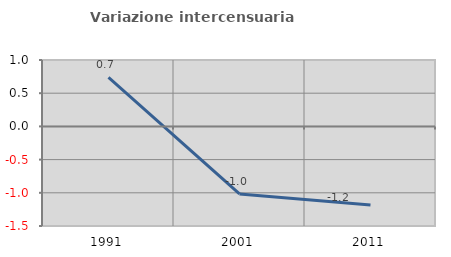
| Category | Variazione intercensuaria annua |
|---|---|
| 1991.0 | 0.737 |
| 2001.0 | -1.018 |
| 2011.0 | -1.183 |